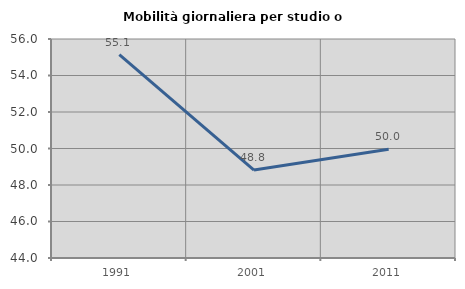
| Category | Mobilità giornaliera per studio o lavoro |
|---|---|
| 1991.0 | 55.149 |
| 2001.0 | 48.819 |
| 2011.0 | 49.957 |